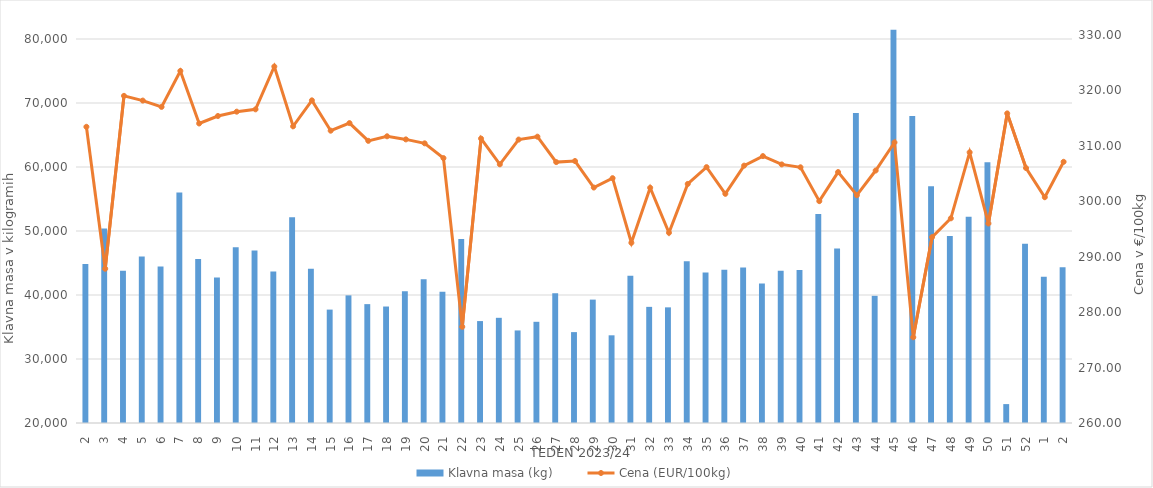
| Category | Klavna masa (kg) |
|---|---|
| 2.0 | 44834 |
| 3.0 | 50386 |
| 4.0 | 43773 |
| 5.0 | 46011 |
| 6.0 | 44439 |
| 7.0 | 56001 |
| 8.0 | 45613 |
| 9.0 | 42730 |
| 10.0 | 47471 |
| 11.0 | 46952 |
| 12.0 | 43683 |
| 13.0 | 52135 |
| 14.0 | 44103 |
| 15.0 | 37719 |
| 16.0 | 39943 |
| 17.0 | 38574 |
| 18.0 | 38200 |
| 19.0 | 40581 |
| 20.0 | 42443 |
| 21.0 | 40517 |
| 22.0 | 48742 |
| 23.0 | 35927 |
| 24.0 | 36436 |
| 25.0 | 34463 |
| 26.0 | 35812 |
| 27.0 | 40280 |
| 28.0 | 34201 |
| 29.0 | 39279 |
| 30.0 | 33702 |
| 31.0 | 43020 |
| 32.0 | 38146 |
| 33.0 | 38070 |
| 34.0 | 45290 |
| 35.0 | 43513 |
| 36.0 | 43945 |
| 37.0 | 44302 |
| 38.0 | 41798 |
| 39.0 | 43790 |
| 40.0 | 43913 |
| 41.0 | 52663 |
| 42.0 | 47275 |
| 43.0 | 68419 |
| 44.0 | 39872 |
| 45.0 | 81439 |
| 46.0 | 67983 |
| 47.0 | 57006 |
| 48.0 | 49204 |
| 49.0 | 52219 |
| 50.0 | 60759 |
| 51.0 | 22954 |
| 52.0 | 48002 |
| 1.0 | 42866 |
| 2.0 | 44318 |